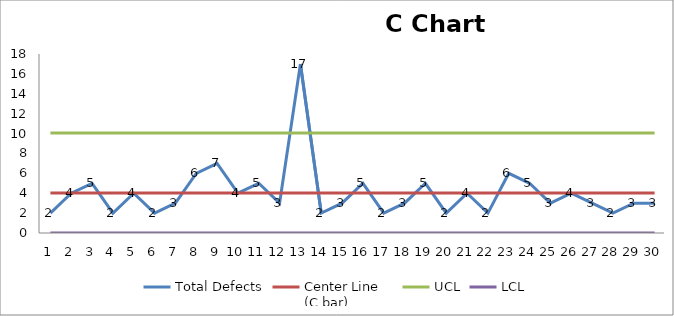
| Category | Total Defects | Center Line 
(C bar) | UCL | LCL |
|---|---|---|---|---|
| 0 | 2 | 4.033 | 10.058 | 0 |
| 1 | 4 | 4.033 | 10.058 | 0 |
| 2 | 5 | 4.033 | 10.058 | 0 |
| 3 | 2 | 4.033 | 10.058 | 0 |
| 4 | 4 | 4.033 | 10.058 | 0 |
| 5 | 2 | 4.033 | 10.058 | 0 |
| 6 | 3 | 4.033 | 10.058 | 0 |
| 7 | 6 | 4.033 | 10.058 | 0 |
| 8 | 7 | 4.033 | 10.058 | 0 |
| 9 | 4 | 4.033 | 10.058 | 0 |
| 10 | 5 | 4.033 | 10.058 | 0 |
| 11 | 3 | 4.033 | 10.058 | 0 |
| 12 | 17 | 4.033 | 10.058 | 0 |
| 13 | 2 | 4.033 | 10.058 | 0 |
| 14 | 3 | 4.033 | 10.058 | 0 |
| 15 | 5 | 4.033 | 10.058 | 0 |
| 16 | 2 | 4.033 | 10.058 | 0 |
| 17 | 3 | 4.033 | 10.058 | 0 |
| 18 | 5 | 4.033 | 10.058 | 0 |
| 19 | 2 | 4.033 | 10.058 | 0 |
| 20 | 4 | 4.033 | 10.058 | 0 |
| 21 | 2 | 4.033 | 10.058 | 0 |
| 22 | 6 | 4.033 | 10.058 | 0 |
| 23 | 5 | 4.033 | 10.058 | 0 |
| 24 | 3 | 4.033 | 10.058 | 0 |
| 25 | 4 | 4.033 | 10.058 | 0 |
| 26 | 3 | 4.033 | 10.058 | 0 |
| 27 | 2 | 4.033 | 10.058 | 0 |
| 28 | 3 | 4.033 | 10.058 | 0 |
| 29 | 3 | 4.033 | 10.058 | 0 |